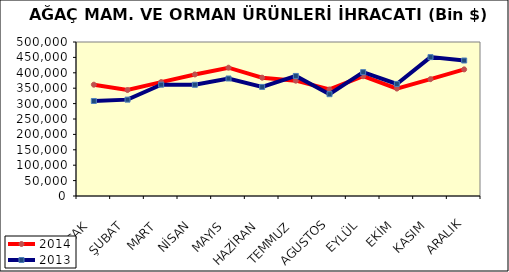
| Category | 2014 | 2013 |
|---|---|---|
| OCAK | 361374.962 | 308442.913 |
| ŞUBAT | 344101.192 | 312886.184 |
| MART | 369867.522 | 361373.559 |
| NİSAN | 394700.911 | 361138.326 |
| MAYIS | 416568.232 | 381482.92 |
| HAZİRAN | 384169.357 | 354145.401 |
| TEMMUZ | 374449.832 | 389802.722 |
| AGUSTOS | 345848.773 | 330581.499 |
| EYLÜL | 388901.315 | 402117.248 |
| EKİM | 348798.607 | 363788.886 |
| KASIM | 379374.696 | 450887.582 |
| ARALIK | 411125.464 | 439890.296 |